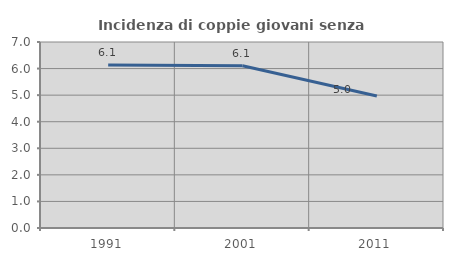
| Category | Incidenza di coppie giovani senza figli |
|---|---|
| 1991.0 | 6.138 |
| 2001.0 | 6.106 |
| 2011.0 | 4.966 |